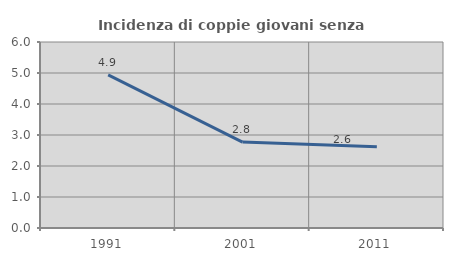
| Category | Incidenza di coppie giovani senza figli |
|---|---|
| 1991.0 | 4.942 |
| 2001.0 | 2.773 |
| 2011.0 | 2.619 |